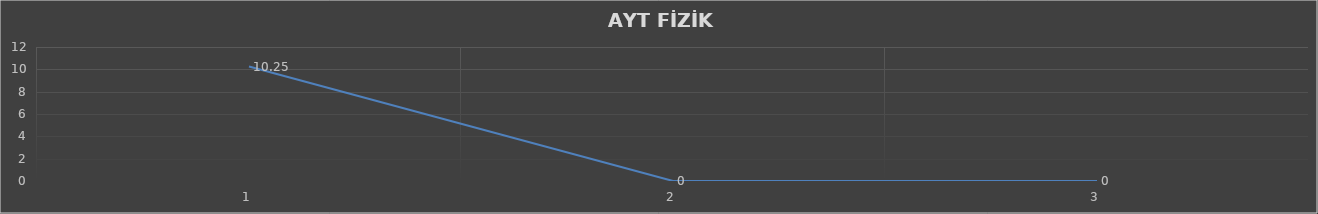
| Category | Series 0 |
|---|---|
| 0 | 10.25 |
| 1 | 0 |
| 2 | 0 |